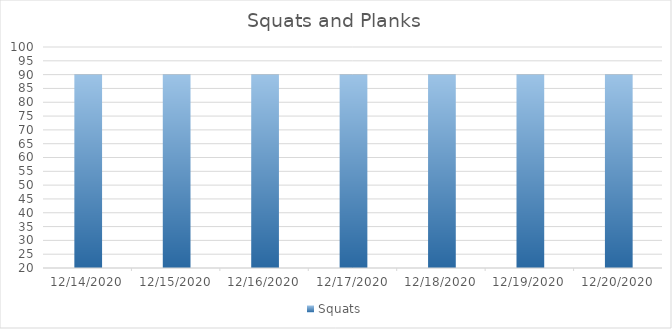
| Category | Squats |
|---|---|
| 12/14/20 | 90 |
| 12/15/20 | 90 |
| 12/16/20 | 90 |
| 12/17/20 | 90 |
| 12/18/20 | 90 |
| 12/19/20 | 90 |
| 12/20/20 | 90 |